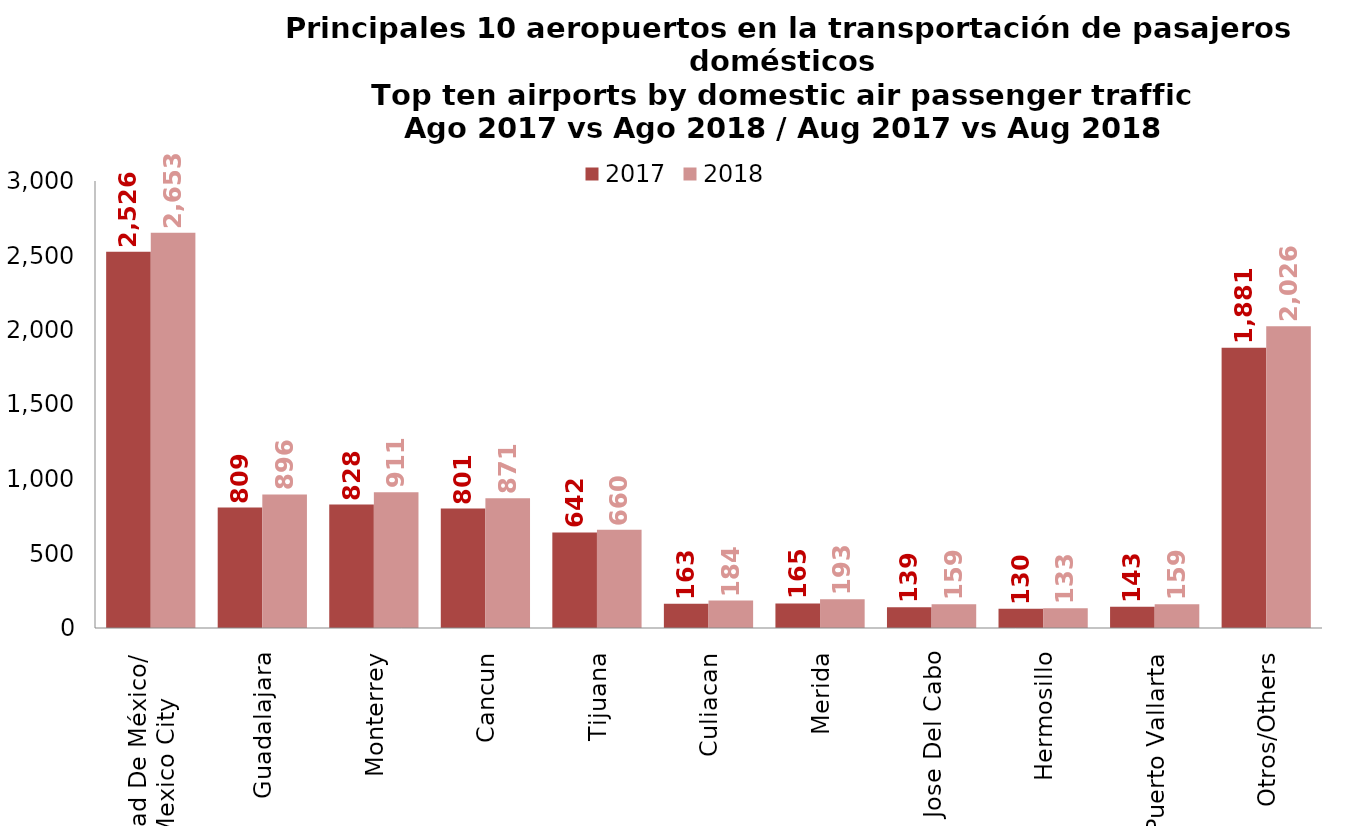
| Category | 2017 | 2018 |
|---|---|---|
| Ciudad De México/
Mexico City | 2526.005 | 2652.795 |
| Guadalajara | 808.637 | 896.386 |
| Monterrey | 828.305 | 910.634 |
| Cancun | 801.225 | 871.321 |
| Tijuana | 641.732 | 659.659 |
| Culiacan | 163.087 | 183.958 |
| Merida | 164.618 | 192.64 |
| San Jose Del Cabo | 138.777 | 159.117 |
| Hermosillo | 129.797 | 133.088 |
| Puerto Vallarta | 143.232 | 159.165 |
| Otros/Others | 1881.36 | 2025.676 |